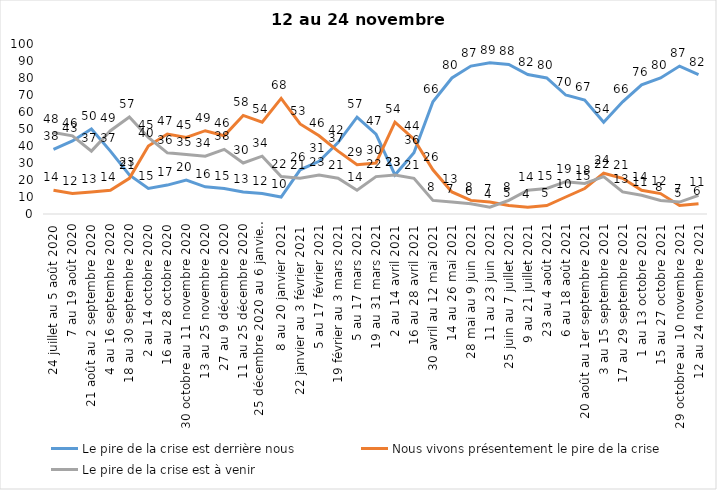
| Category | Le pire de la crise est derrière nous | Nous vivons présentement le pire de la crise | Le pire de la crise est à venir |
|---|---|---|---|
| 24 juillet au 5 août 2020 | 38 | 14 | 48 |
| 7 au 19 août 2020 | 43 | 12 | 46 |
| 21 août au 2 septembre 2020 | 50 | 13 | 37 |
| 4 au 16 septembre 2020 | 37 | 14 | 49 |
| 18 au 30 septembre 2020 | 23 | 21 | 57 |
| 2 au 14 octobre 2020 | 15 | 40 | 45 |
| 16 au 28 octobre 2020 | 17 | 47 | 36 |
| 30 octobre au 11 novembre 2020 | 20 | 45 | 35 |
| 13 au 25 novembre 2020 | 16 | 49 | 34 |
| 27 au 9 décembre 2020 | 15 | 46 | 38 |
| 11 au 25 décembre 2020 | 13 | 58 | 30 |
| 25 décembre 2020 au 6 janvier 2021 | 12 | 54 | 34 |
| 8 au 20 janvier 2021 | 10 | 68 | 22 |
| 22 janvier au 3 février 2021 | 26 | 53 | 21 |
| 5 au 17 février 2021 | 31 | 46 | 23 |
| 19 février au 3 mars 2021 | 42 | 37 | 21 |
| 5 au 17 mars 2021 | 57 | 29 | 14 |
| 19 au 31 mars 2021 | 47 | 30 | 22 |
| 2 au 14 avril 2021 | 23 | 54 | 23 |
| 16 au 28 avril 2021 | 36 | 44 | 21 |
| 30 avril au 12 mai 2021 | 66 | 26 | 8 |
| 14 au 26 mai 2021 | 80 | 13 | 7 |
| 28 mai au 9 juin 2021 | 87 | 8 | 6 |
| 11 au 23 juin 2021 | 89 | 7 | 4 |
| 25 juin au 7 juillet 2021 | 88 | 5 | 8 |
| 9 au 21 juillet 2021 | 82 | 4 | 14 |
| 23 au 4 août 2021 | 80 | 5 | 15 |
| 6 au 18 août 2021 | 70 | 10 | 19 |
| 20 août au 1er septembre 2021 | 67 | 15 | 18 |
| 3 au 15 septembre 2021 | 54 | 24 | 22 |
| 17 au 29 septembre 2021 | 66 | 21 | 13 |
| 1 au 13 octobre 2021 | 76 | 14 | 11 |
| 15 au 27 octobre 2021 | 80 | 12 | 8 |
| 29 octobre au 10 novembre 2021 | 87 | 5 | 7 |
| 12 au 24 novembre 2021 | 82 | 6 | 11 |